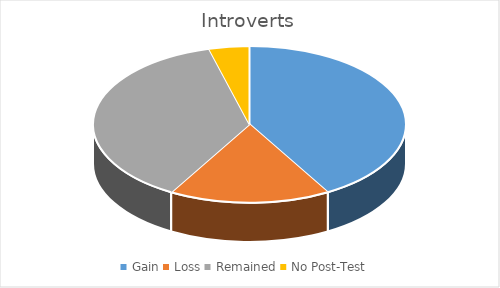
| Category | Series 0 |
|---|---|
| Gain | 10 |
| Loss | 4 |
| Remained | 9 |
| No Post-Test | 1 |